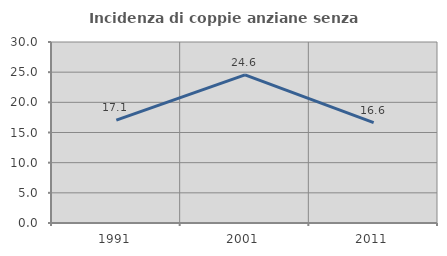
| Category | Incidenza di coppie anziane senza figli  |
|---|---|
| 1991.0 | 17.056 |
| 2001.0 | 24.561 |
| 2011.0 | 16.624 |